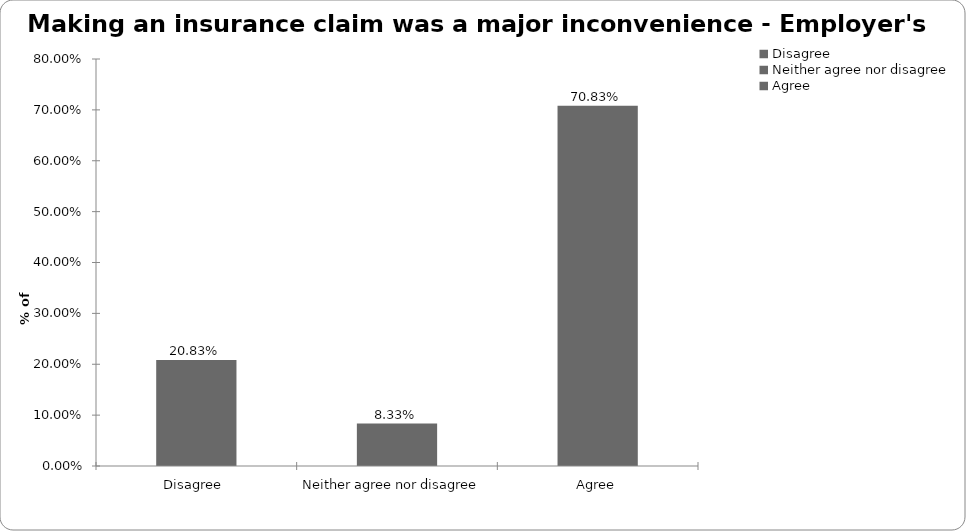
| Category | Employer's liability |
|---|---|
| Disagree  | 0.208 |
| Neither agree nor disagree  | 0.083 |
| Agree | 0.708 |